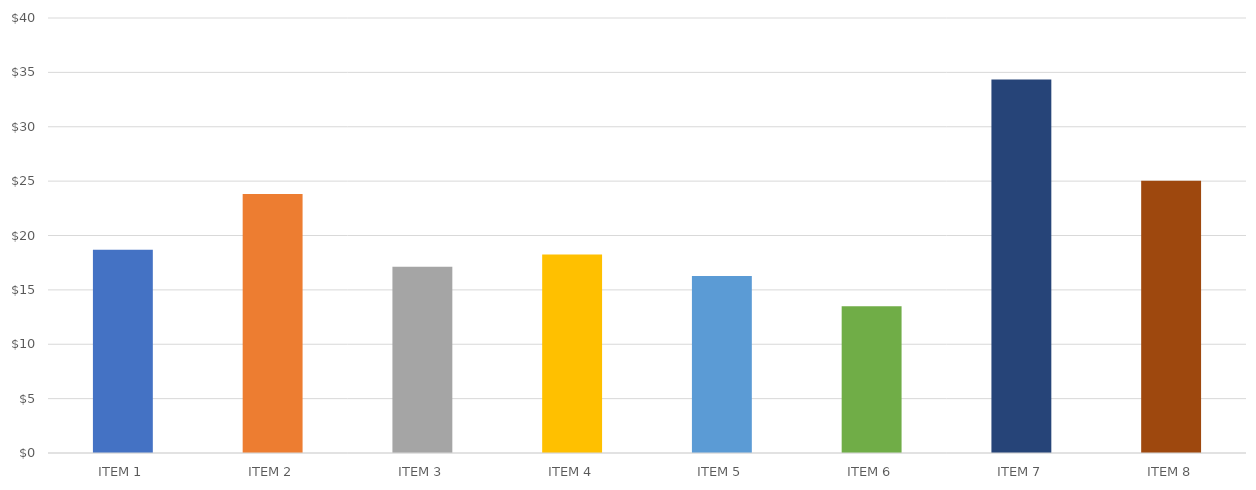
| Category | PROFIT PER ITEM |
|---|---|
| ITEM 1 | 18.685 |
| ITEM 2 | 23.815 |
| ITEM 3 | 17.125 |
| ITEM 4 | 18.25 |
| ITEM 5 | 16.275 |
| ITEM 6 | 13.5 |
| ITEM 7 | 34.35 |
| ITEM 8 | 25.04 |